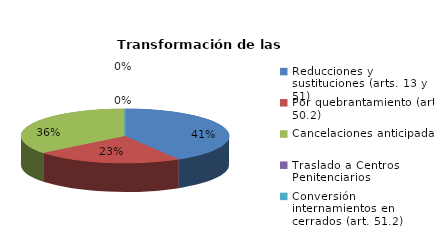
| Category | Series 0 |
|---|---|
| Reducciones y sustituciones (arts. 13 y 51) | 29 |
| Por quebrantamiento (art. 50.2) | 16 |
| Cancelaciones anticipadas | 25 |
| Traslado a Centros Penitenciarios | 0 |
| Conversión internamientos en cerrados (art. 51.2) | 0 |